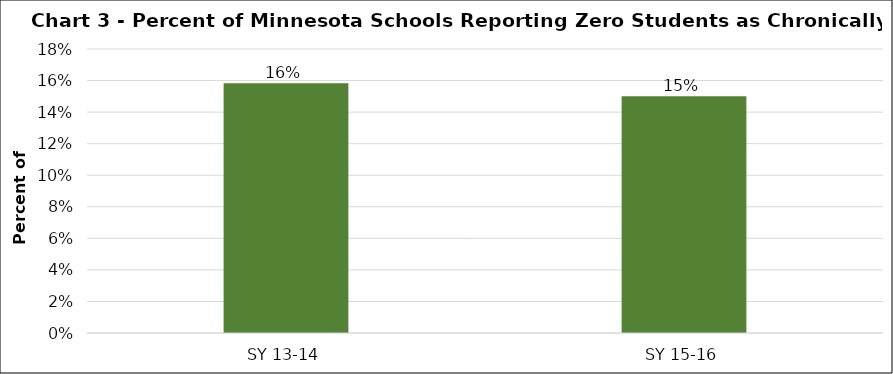
| Category | Series 0 |
|---|---|
| SY 13-14 | 0.158 |
| SY 15-16 | 0.15 |